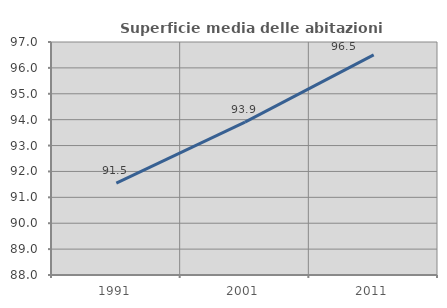
| Category | Superficie media delle abitazioni occupate |
|---|---|
| 1991.0 | 91.549 |
| 2001.0 | 93.906 |
| 2011.0 | 96.505 |